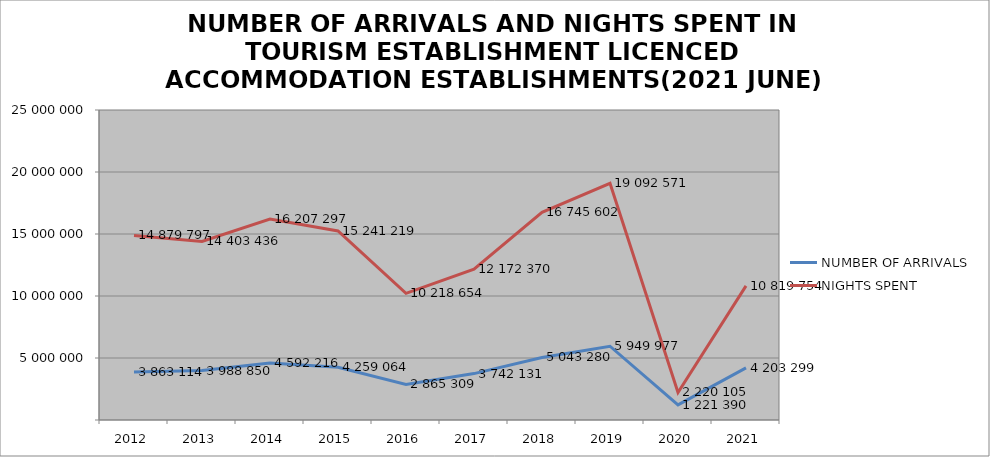
| Category | NUMBER OF ARRIVALS | NIGHTS SPENT |
|---|---|---|
| 2012 | 3863114 | 14879797 |
| 2013 | 3988850 | 14403436 |
| 2014 | 4592216 | 16207297 |
| 2015 | 4259064 | 15241219 |
| 2016 | 2865309 | 10218654 |
| 2017 | 3742131 | 12172370 |
| 2018 | 5043280 | 16745602 |
| 2019 | 5949977 | 19092571 |
| 2020 | 1221390 | 2220105 |
| 2021 | 4203299 | 10819754 |